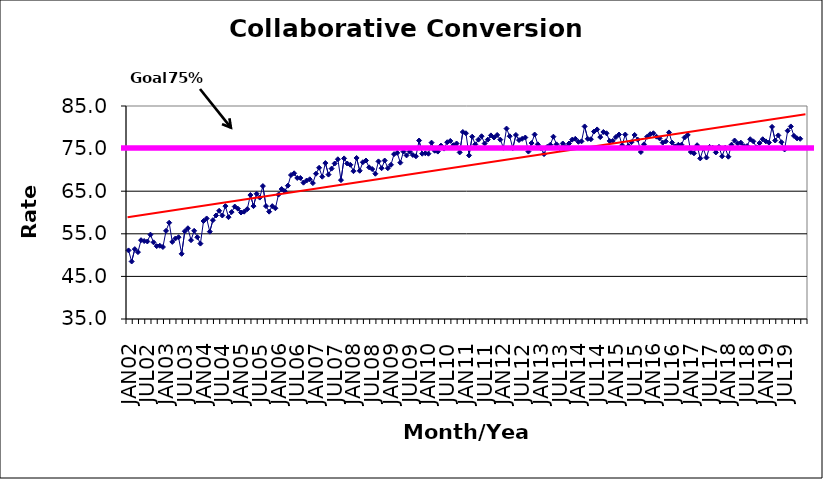
| Category | Series 0 |
|---|---|
| JAN02 | 51.1 |
| FEB02 | 48.5 |
| MAR02 | 51.4 |
| APR02 | 50.7 |
| MAY02 | 53.5 |
| JUN02 | 53.3 |
| JUL02 | 53.2 |
| AUG02 | 54.8 |
| SEP02 | 53 |
| OCT02 | 52.1 |
| NOV02 | 52.2 |
| DEC02 | 51.9 |
| JAN03 | 55.7 |
| FEB03 | 57.6 |
| MAR03 | 53.1 |
| APR03 | 53.9 |
| MAY03 | 54.2 |
| JUN03 | 50.3 |
| JUL03 | 55.6 |
| AUG03 | 56.3 |
| SEP03 | 53.5 |
| OCT03 | 55.7 |
| NOV03 | 54.2 |
| DEC03 | 52.7 |
| JAN04 | 58 |
| FEB04 | 58.6 |
| MAR04 | 55.5 |
| APR04 | 58.2 |
| MAY04 | 59.3 |
| JUN04 | 60.4 |
| JUL04 | 59.3 |
| AUG04 | 61.5 |
| SEP04 | 58.9 |
| OCT04 | 60.1 |
| NOV04 | 61.4 |
| DEC04 | 60.9 |
| JAN05 | 60 |
| FEB05 | 60.2 |
| MAR05 | 60.8 |
| APR05 | 64.1 |
| MAY05 | 61.5 |
| JUN05 | 64.4 |
| JUL05 | 63.5 |
| AUG05 | 66.2 |
| SEP05 | 61.5 |
| OCT05 | 60.2 |
| NOV05 | 61.5 |
| DEC05 | 61 |
| JAN06 | 64.2 |
| FEB06 | 65.5 |
| MAR06 | 65 |
| APR06 | 66.3 |
| MAY06 | 68.8 |
| JUN06 | 69.2 |
| JUL06 | 68.1 |
| AUG06 | 68.1 |
| SEP06 | 67 |
| OCT06 | 67.5 |
| NOV06 | 67.8 |
| DEC06 | 66.9 |
| JAN07 | 69.1 |
| FEB07 | 70.5 |
| MAR07 | 68.4 |
| APR07 | 71.6 |
| MAY07 | 68.9 |
| JUN07 | 70.3 |
| JUL07 | 71.5 |
| AUG07 | 72.5 |
| SEP07 | 67.6 |
| OCT07 | 72.7 |
| NOV07 | 71.5 |
| DEC07 | 71.2 |
| JAN08 | 69.7 |
| FEB08 | 72.8 |
| MAR08 | 69.8 |
| APR08 | 71.8 |
| MAY08 | 72.2 |
| JUN08 | 70.6 |
| JUL08 | 70.2 |
| AUG08 | 69.1 |
| SEP08 | 72 |
| OCT08 | 70.4 |
| NOV08 | 72.2 |
| DEC08 | 70.4 |
| JAN09 | 71.2 |
| FEB09 | 73.7 |
| MAR09 | 74 |
| APR09 | 71.7 |
| MAY09 | 74.3 |
| JUN09 | 73.4 |
| JUL09 | 74.3 |
| AUG09 | 73.5 |
| SEP09 | 73.2 |
| OCT09 | 76.9 |
| NOV09 | 73.8 |
| DEC09 | 73.9 |
| JAN10 | 73.8 |
| FEB10 | 76.4 |
| MAR10 | 74.5 |
| APR10 | 74.3 |
| MAY10 | 75.7 |
| JUN10 | 75 |
| JUL10 | 76.5 |
| AUG10 | 76.8 |
| SEP10 | 75.8 |
| OCT10 | 76.2 |
| NOV10 | 74.1 |
| DEC10 | 78.9 |
| JAN11 | 78.6 |
| FEB11 | 73.4 |
| MAR11 | 77.8 |
| APR11 | 76 |
| MAY11 | 77.1 |
| JUN11 | 77.9 |
| JUL11 | 76.2 |
| AUG11 | 77.1 |
| SEP11 | 78.1 |
| OCT11 | 77.6 |
| NOV11 | 78.2 |
| DEC11 | 77.1 |
| JAN12 | 75.2 |
| FEB12 | 79.7 |
| MAR12 | 77.9 |
| APR12 | 75.1 |
| MAY12 | 78.2 |
| JUN12 | 77 |
| JUL12 | 77.3 |
| AUG12 | 77.6 |
| SEP12 | 74.3 |
| OCT12 | 76.3 |
| NOV12 | 78.3 |
| DEC12 | 76 |
| JAN13 | 75.1 |
| FEB13 | 73.7 |
| MAR13 | 75.4 |
| APR13 | 75.9 |
| MAY13 | 77.8 |
| JUN13 | 76 |
| JUL13 | 75.1 |
| AUG13 | 76.2 |
| SEP13 | 75.4 |
| OCT13 | 76.2 |
| NOV13 | 77.1 |
| DEC13 | 77.3 |
| JAN14 | 76.6 |
| FEB14 | 76.7 |
| MAR14 | 80.2 |
| APR14 | 77.3 |
| MAY14 | 77.2 |
| JUN14 | 79 |
| JUL14 | 79.5 |
| AUG14 | 77.7 |
| SEP14 | 78.9 |
| OCT14 | 78.6 |
| NOV14 | 76.8 |
| DEC14 | 76.8 |
| JAN15 | 77.7 |
| FEB15 | 78.3 |
| MAR15 | 75.8 |
| APR15 | 78.3 |
| MAY15 | 75.6 |
| JUN15 | 76.5 |
| JUL15 | 78.2 |
| AUG15 | 77.1 |
| SEP15 | 74.2 |
| OCT15 | 76 |
| NOV15 | 77.8 |
| DEC15 | 78.4 |
| JAN16 | 78.6 |
| FEB16 | 77.8 |
| MAR16 | 77.4 |
| APR16 | 76.4 |
| MAY16 | 76.7 |
| JUN16 | 78.8 |
| JUL16 | 76.4 |
| AUG16 | 75.5 |
| SEP16 | 75.9 |
| OCT16 | 75.9 |
| NOV16 | 77.6 |
| DEC16 | 78.2 |
| JAN17 | 74.2 |
| FEB17 | 73.9 |
| MAR17 | 75.8 |
| APR17 | 72.7 |
| MAY17 | 75 |
| JUN17 | 72.9 |
| JUL17 | 75.4 |
| AUG17 | 75.2 |
| SEP17 | 74.1 |
| OCT17 | 75.4 |
| NOV17 | 73.2 |
| DEC17 | 75.2 |
| JAN18 | 73.1 |
| FEB18 | 75.9 |
| MAR18 | 76.9 |
| APR18 | 76.2 |
| MAY18 | 76.4 |
| JUN18 | 75.6 |
| JUL18 | 75.6 |
| AUG18 | 77.2 |
| SEP18 | 76.7 |
| OCT18 | 75.3 |
| NOV18 | 76.3 |
| DEC18 | 77.2 |
| JAN19 | 76.7 |
| FEB19 | 76.4 |
| MAR19 | 80.1 |
| APR19 | 76.9 |
| MAY19 | 78.1 |
| JUN19 | 76.5 |
| JUL19 | 74.8 |
| AUG19 | 79.2 |
| SEP19 | 80.2 |
| OCT19 | 78 |
| NOV19 | 77.4 |
| DEC19 | 77.3 |